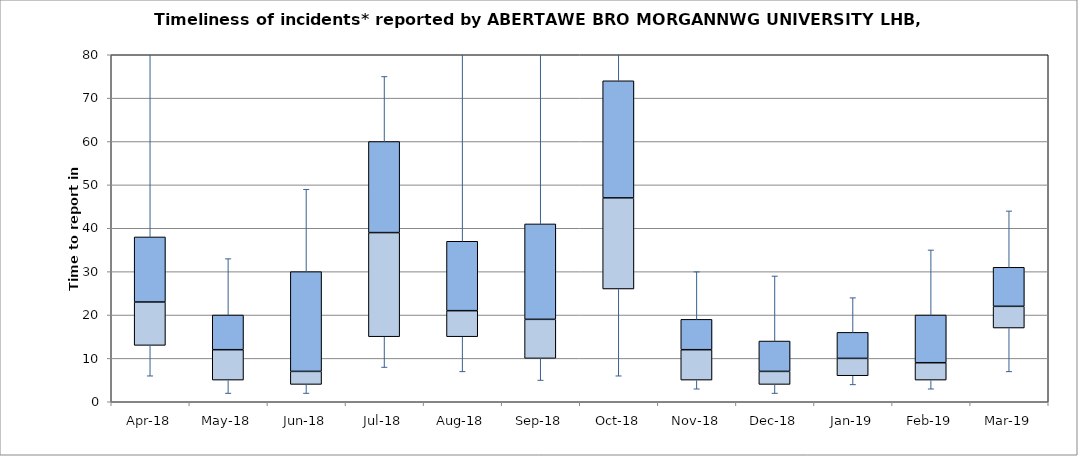
| Category | Series 0 | Series 1 | Series 2 |
|---|---|---|---|
| Apr-18 | 13 | 10 | 15 |
| May-18 | 5 | 7 | 8 |
| Jun-18 | 4 | 3 | 23 |
| Jul-18 | 15 | 24 | 21 |
| Aug-18 | 15 | 6 | 16 |
| Sep-18 | 10 | 9 | 22 |
| Oct-18 | 26 | 21 | 27 |
| Nov-18 | 5 | 7 | 7 |
| Dec-18 | 4 | 3 | 7 |
| Jan-19 | 6 | 4 | 6 |
| Feb-19 | 5 | 4 | 11 |
| Mar-19 | 17 | 5 | 9 |